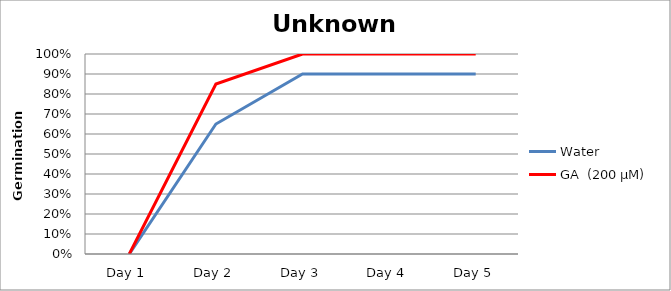
| Category | Water | GA  (200 µM)  |
|---|---|---|
| Day 1 | 0 | 0 |
| Day 2 | 0.65 | 0.85 |
| Day 3 | 0.9 | 1 |
| Day 4 | 0.9 | 1 |
| Day 5 | 0.9 | 1 |